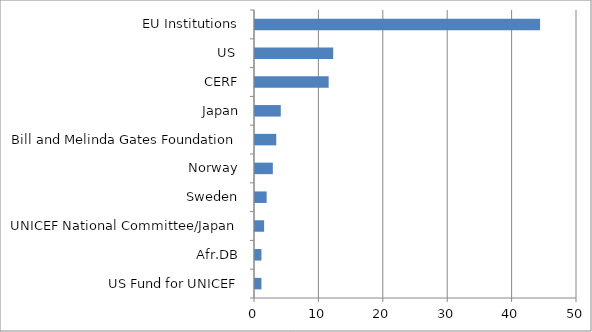
| Category | Grand Total |
|---|---|
| US Fund for UNICEF | 1 |
| Afr.DB | 1 |
| UNICEF National Committee/Japan | 1.416 |
| Sweden | 1.809 |
| Norway | 2.768 |
| Bill and Melinda Gates Foundation | 3.3 |
| Japan | 4.004 |
| CERF | 11.436 |
| US  | 12.144 |
| EU Institutions | 44.264 |